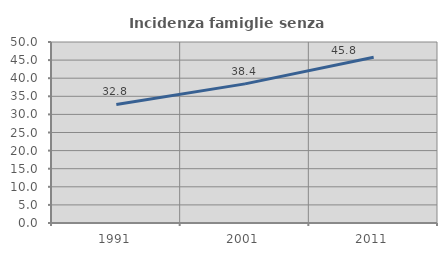
| Category | Incidenza famiglie senza nuclei |
|---|---|
| 1991.0 | 32.757 |
| 2001.0 | 38.428 |
| 2011.0 | 45.795 |